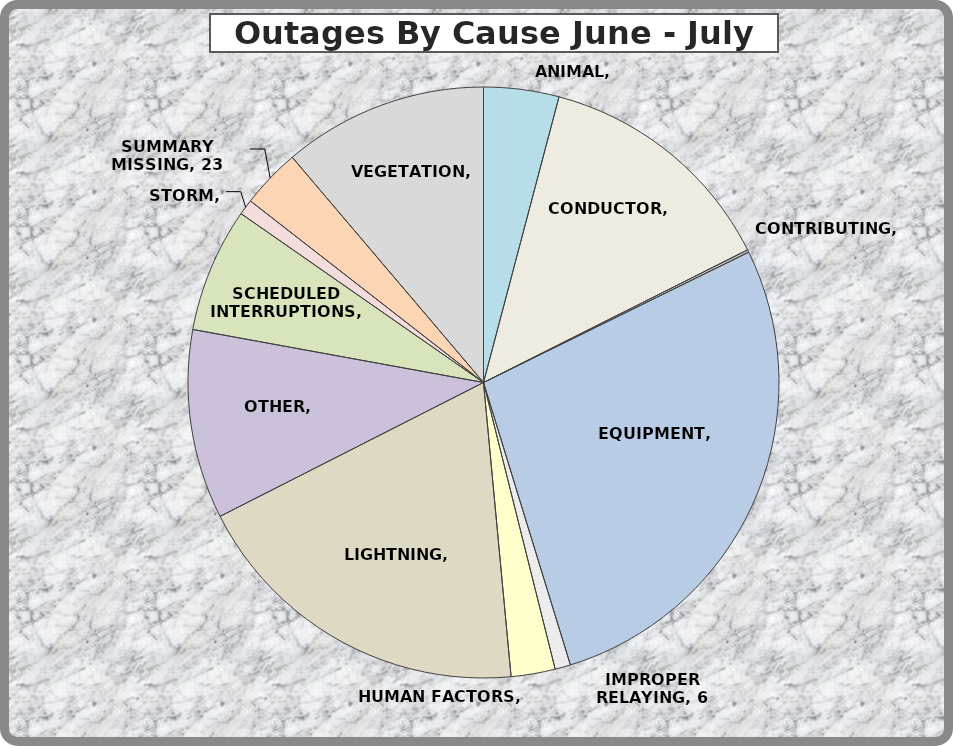
| Category | Series 0 |
|---|---|
| ANIMAL | 29 |
| CONDUCTOR | 95 |
| CONTRIBUTING | 1 |
| EQUIPMENT | 194 |
| IMPROPER RELAYING | 6 |
| HUMAN FACTORS | 17 |
| LIGHTNING | 134 |
| OTHER | 73 |
| SCHEDULED INTERRUPTIONS | 48 |
| STORM | 6 |
| SUMMARY MISSING | 23 |
| VEGETATION | 79 |